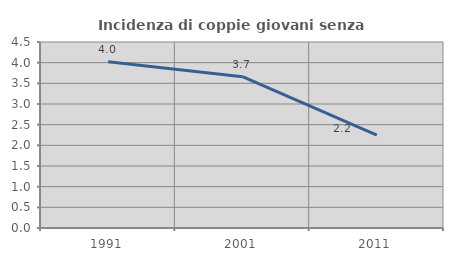
| Category | Incidenza di coppie giovani senza figli |
|---|---|
| 1991.0 | 4.021 |
| 2001.0 | 3.66 |
| 2011.0 | 2.246 |